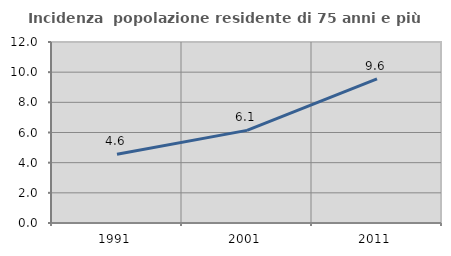
| Category | Incidenza  popolazione residente di 75 anni e più |
|---|---|
| 1991.0 | 4.552 |
| 2001.0 | 6.141 |
| 2011.0 | 9.555 |